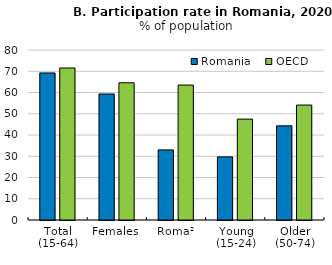
| Category | Romania | OECD |
|---|---|---|
| Total (15-64) | 69.2 | 71.534 |
| Females | 59.3 | 64.574 |
| Roma² | 33 | 63.5 |
| Young (15-24) | 29.7 | 47.471 |
| Older (50-74) | 44.3 | 54.093 |